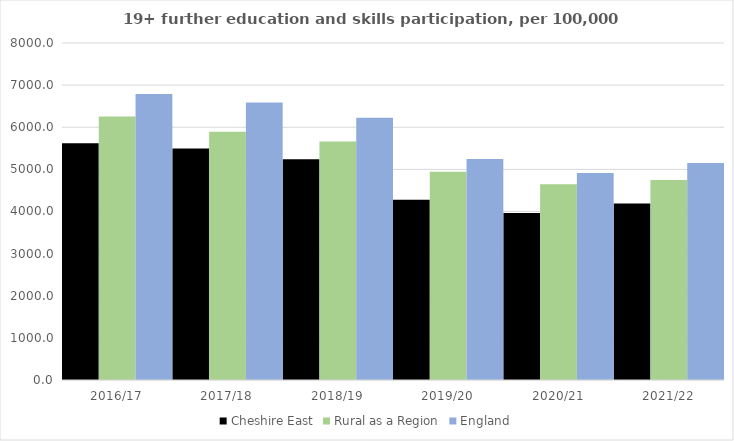
| Category | Cheshire East | Rural as a Region | England |
|---|---|---|---|
| 2016/17 | 5621 | 6253.401 | 6788 |
| 2017/18 | 5493 | 5892.029 | 6588 |
| 2018/19 | 5243 | 5661.873 | 6227 |
| 2019/20 | 4278 | 4943.801 | 5244 |
| 2020/21 | 3965 | 4646.727 | 4913 |
| 2021/22 | 4190 | 4747.049 | 5151 |